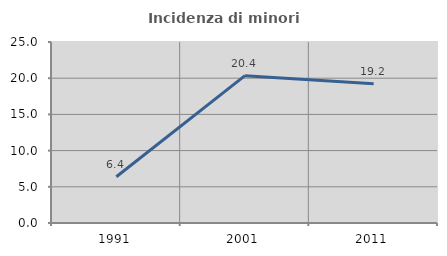
| Category | Incidenza di minori stranieri |
|---|---|
| 1991.0 | 6.383 |
| 2001.0 | 20.351 |
| 2011.0 | 19.217 |